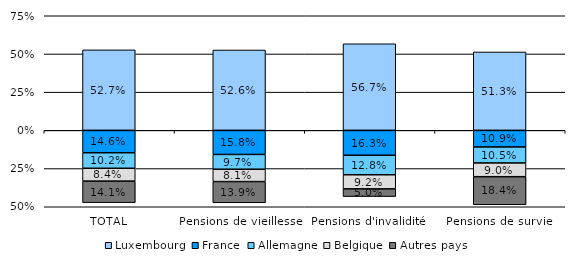
| Category | Luxembourg | France | Allemagne | Belgique | Autres pays |
|---|---|---|---|---|---|
| TOTAL | 0.527 | -0.146 | -0.102 | -0.084 | -0.141 |
| Pensions de vieillesse | 0.526 | -0.158 | -0.097 | -0.081 | -0.139 |
| Pensions d'invalidité  | 0.567 | -0.163 | -0.128 | -0.092 | -0.05 |
| Pensions de survie  | 0.513 | -0.109 | -0.105 | -0.09 | -0.184 |